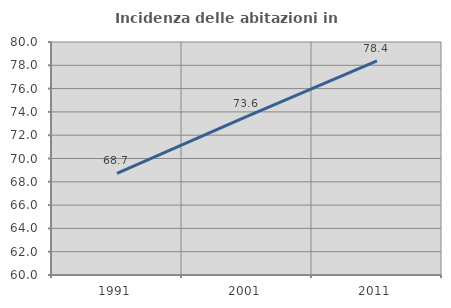
| Category | Incidenza delle abitazioni in proprietà  |
|---|---|
| 1991.0 | 68.729 |
| 2001.0 | 73.622 |
| 2011.0 | 78.382 |